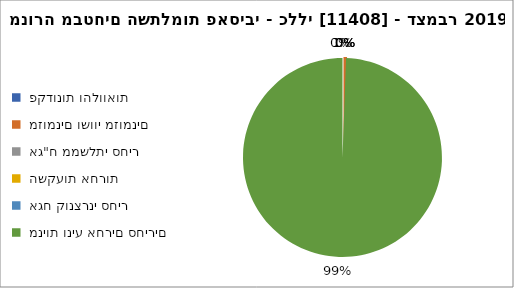
| Category | מנורה מבטחים השתלמות פאסיבי - כללי [11408] - דצמבר 2019 |
|---|---|
|  פקדונות והלוואות  | 0 |
|  מזומנים ושווי מזומנים   | 111 |
|  אג"ח ממשלתי סחיר  | 0 |
|  השקעות אחרות  | 0 |
|  אגח קונצרני סחיר  | 0 |
|  מניות וניע אחרים סחירים   | 19437 |